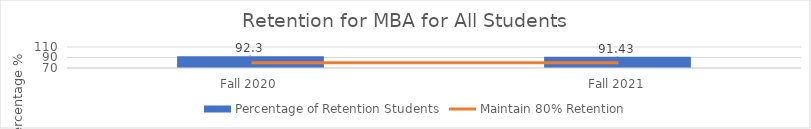
| Category | Percentage of Retention Students |
|---|---|
| Fall 2020 | 92.3 |
| Fall 2021 | 91.43 |